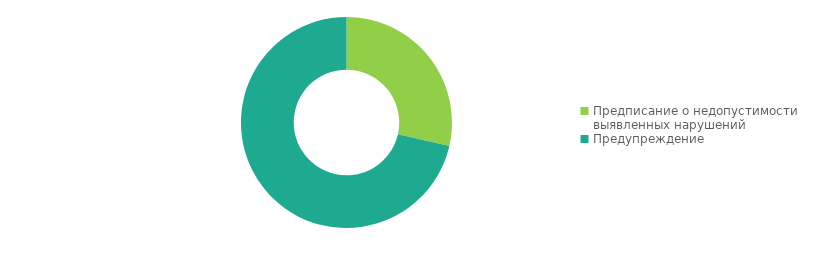
| Category | Series 0 |
|---|---|
| Предписание о недопустимости выявленных нарушений | 2 |
| Предупреждение | 5 |